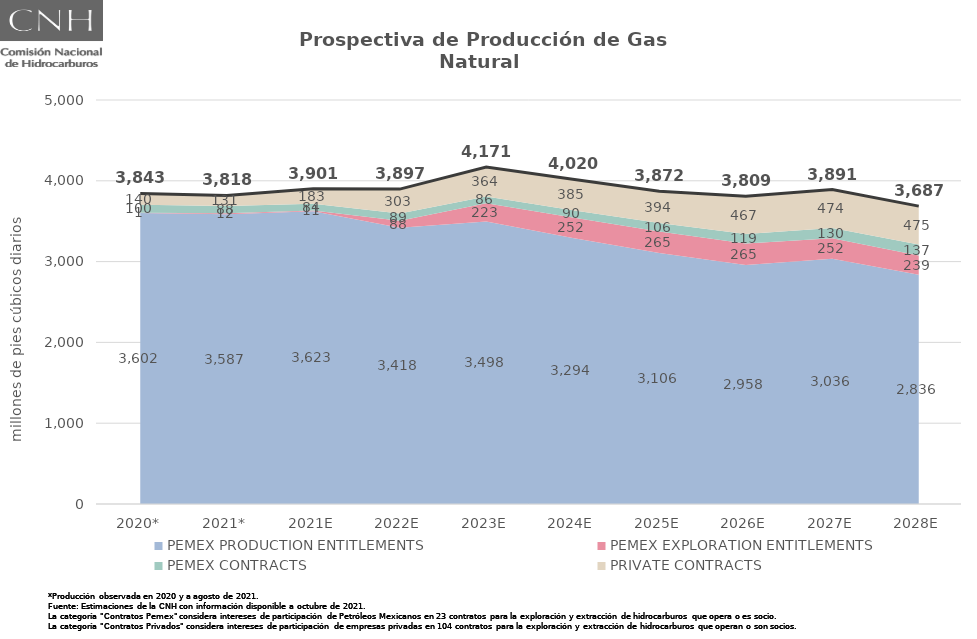
| Category | Total |
|---|---|
| 2020* | 3843.295 |
| 2021* | 3818.201 |
| 2021E | 3900.738 |
| 2022E | 3897.359 |
| 2023E | 4171.053 |
| 2024E | 4020.436 |
| 2025E | 3871.76 |
| 2026E | 3808.537 |
| 2027E | 3890.923 |
| 2028E | 3686.74 |